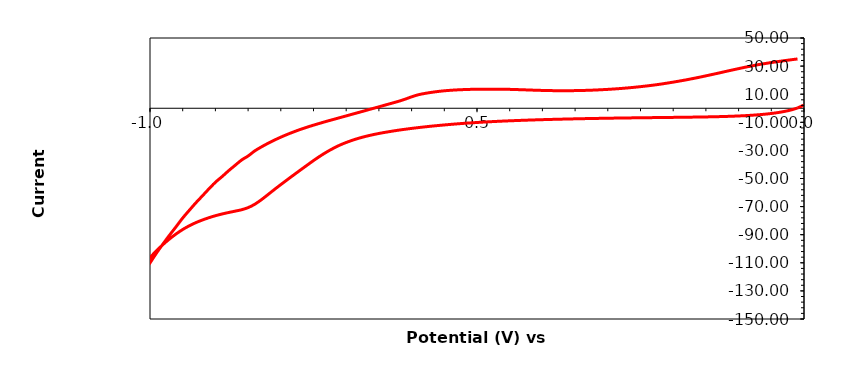
| Category | Series 0 |
|---|---|
| 6.24657e-05 | 2.305 |
| -0.00993776 | 0.171 |
| -0.019938 | -1.228 |
| -0.0299382 | -2.264 |
| -0.039938 | -3.077 |
| -0.0499382 | -3.72 |
| -0.0599384 | -4.232 |
| -0.0699387 | -4.644 |
| -0.0799389 | -4.987 |
| -0.0899391 | -5.264 |
| -0.0999391 | -5.493 |
| -0.109939 | -5.679 |
| -0.119939 | -5.836 |
| -0.12994 | -5.967 |
| -0.13994 | -6.079 |
| -0.14994 | -6.17 |
| -0.15994 | -6.249 |
| -0.16994 | -6.317 |
| -0.17994 | -6.379 |
| -0.18994 | -6.439 |
| -0.199941 | -6.499 |
| -0.209941 | -6.55 |
| -0.219941 | -6.605 |
| -0.229941 | -6.662 |
| -0.239941 | -6.714 |
| -0.249941 | -6.774 |
| -0.259942 | -6.83 |
| -0.269942 | -6.89 |
| -0.279942 | -6.958 |
| -0.289942 | -7.022 |
| -0.299942 | -7.1 |
| -0.309942 | -7.173 |
| -0.319942 | -7.259 |
| -0.329942 | -7.343 |
| -0.339943 | -7.434 |
| -0.349943 | -7.532 |
| -0.359943 | -7.64 |
| -0.369943 | -7.749 |
| -0.379943 | -7.862 |
| -0.389944 | -7.991 |
| -0.399944 | -8.12 |
| -0.409944 | -8.26 |
| -0.419944 | -8.418 |
| -0.429944 | -8.574 |
| -0.439944 | -8.75 |
| -0.449944 | -8.935 |
| -0.459944 | -9.133 |
| -0.469945 | -9.356 |
| -0.479945 | -9.592 |
| -0.489945 | -9.847 |
| -0.499945 | -10.126 |
| -0.509945 | -10.425 |
| -0.519945 | -10.749 |
| -0.529946 | -11.098 |
| -0.539946 | -11.476 |
| -0.549946 | -11.88 |
| -0.559946 | -12.31 |
| -0.569946 | -12.766 |
| -0.579947 | -13.257 |
| -0.589947 | -13.78 |
| -0.599947 | -14.347 |
| -0.609947 | -14.952 |
| -0.619947 | -15.606 |
| -0.629947 | -16.313 |
| -0.639947 | -17.096 |
| -0.649947 | -17.941 |
| -0.659948 | -18.903 |
| -0.669948 | -19.985 |
| -0.679948 | -21.228 |
| -0.689948 | -22.691 |
| -0.699948 | -24.354 |
| -0.709948 | -26.278 |
| -0.719949 | -28.585 |
| -0.729949 | -31.172 |
| -0.739949 | -34.072 |
| -0.749949 | -37.229 |
| -0.759949 | -40.579 |
| -0.769949 | -43.948 |
| -0.779949 | -47.373 |
| -0.78995 | -50.81 |
| -0.79995 | -54.323 |
| -0.80995 | -57.892 |
| -0.81995 | -61.592 |
| -0.82995 | -65.204 |
| -0.83995 | -68.379 |
| -0.849951 | -70.717 |
| -0.859951 | -72.242 |
| -0.869951 | -73.248 |
| -0.879951 | -74.217 |
| -0.889951 | -75.273 |
| -0.899951 | -76.486 |
| -0.909951 | -77.898 |
| -0.919952 | -79.548 |
| -0.929952 | -81.423 |
| -0.939952 | -83.667 |
| -0.949952 | -86.292 |
| -0.959952 | -89.404 |
| -0.969952 | -92.961 |
| -0.979953 | -96.93 |
| -0.989953 | -101.386 |
| -0.999953 | -106.28 |
| -1.00995 | -111.636 |
| -1.01995 | -117.336 |
| -1.02995 | -123.48 |
| -1.03995 | -129.955 |
| -1.04995 | -136.836 |
| -1.05995 | -144.099 |
| -1.06995 | -151.555 |
| -1.07995 | -159.293 |
| -1.08995 | -167.299 |
| -1.09995 | -176.284 |
| -1.10995 | -184.784 |
| -1.11995 | -193.034 |
| -1.12995 | -201.972 |
| -1.13996 | -211.285 |
| -1.14996 | -220.285 |
| -1.15996 | -229.785 |
| -1.16996 | -239.41 |
| -1.17996 | -248.848 |
| -1.18996 | -258.598 |
| -1.19996 | -268.598 |
| -1.20996 | -278.223 |
| -1.21996 | -288.598 |
| -1.22996 | -298.786 |
| -1.23996 | -309.224 |
| -1.24996 | -319.599 |
| -1.25996 | -330.161 |
| -1.26996 | -340.786 |
| -1.27996 | -351.974 |
| -1.28996 | -362.662 |
| -1.29996 | -373.349 |
| -1.30996 | -384.475 |
| -1.31996 | -395.787 |
| -1.32996 | -406.912 |
| -1.33996 | -417.663 |
| -1.34996 | -429.288 |
| -1.35996 | -440.663 |
| -1.36996 | -452.351 |
| -1.37996 | -464.038 |
| -1.38996 | -475.414 |
| -1.39996 | -487.289 |
| -1.40996 | -499.164 |
| -1.41996 | -510.977 |
| -1.42996 | -523.164 |
| -1.43996 | -534.977 |
| -1.44996 | -547.102 |
| -1.45996 | -559.165 |
| -1.46996 | -571.665 |
| -1.47996 | -583.915 |
| -1.48996 | -596.04 |
| -1.49996 | -608.666 |
| -1.50996 | -620.916 |
| -1.51996 | -633.353 |
| -1.52996 | -646.041 |
| -1.53996 | -658.479 |
| -1.54996 | -671.479 |
| -1.55996 | -683.854 |
| -1.56996 | -696.542 |
| -1.57996 | -708.855 |
| -1.58996 | -722.23 |
| -1.59996 | -734.668 |
| -1.60996 | -747.48 |
| -1.61996 | -760.293 |
| -1.62996 | -772.981 |
| -1.63996 | -786.231 |
| -1.64996 | -799.294 |
| -1.65996 | -812.419 |
| -1.66996 | -825.106 |
| -1.67996 | -838.169 |
| -1.68996 | -851.419 |
| -1.69996 | -864.169 |
| -1.70996 | -876.545 |
| -1.71996 | -889.67 |
| -1.72996 | -902.858 |
| -1.73996 | -916.42 |
| -1.74996 | -929.608 |
| -1.75996 | -942.858 |
| -1.76996 | -955.046 |
| -1.77996 | -968.359 |
| -1.78996 | -981.296 |
| -1.79997 | -994.234 |
| -1.78996 | -981.359 |
| -1.77996 | -968.421 |
| -1.76996 | -955.233 |
| -1.75996 | -942.233 |
| -1.74996 | -928.733 |
| -1.73996 | -916.42 |
| -1.72996 | -903.295 |
| -1.71996 | -890.732 |
| -1.70996 | -877.92 |
| -1.69996 | -865.107 |
| -1.68996 | -852.232 |
| -1.67996 | -839.544 |
| -1.66996 | -826.669 |
| -1.65996 | -814.481 |
| -1.64996 | -801.731 |
| -1.63996 | -788.856 |
| -1.62996 | -776.731 |
| -1.61996 | -764.355 |
| -1.60996 | -751.793 |
| -1.59996 | -739.168 |
| -1.58996 | -726.792 |
| -1.57996 | -714.605 |
| -1.56996 | -702.292 |
| -1.55996 | -689.792 |
| -1.54996 | -677.479 |
| -1.53996 | -665.104 |
| -1.52996 | -653.229 |
| -1.51996 | -641.354 |
| -1.50996 | -628.853 |
| -1.49996 | -616.853 |
| -1.48996 | -604.853 |
| -1.47996 | -592.853 |
| -1.46996 | -580.853 |
| -1.45996 | -569.103 |
| -1.44996 | -557.477 |
| -1.43996 | -545.727 |
| -1.42996 | -533.914 |
| -1.41996 | -522.289 |
| -1.40996 | -510.664 |
| -1.39996 | -499.351 |
| -1.38996 | -488.039 |
| -1.37996 | -476.164 |
| -1.36996 | -464.851 |
| -1.35996 | -453.351 |
| -1.34996 | -442.163 |
| -1.33996 | -431.038 |
| -1.32996 | -420.038 |
| -1.31996 | -408.725 |
| -1.30996 | -397.85 |
| -1.29996 | -386.85 |
| -1.28996 | -376.35 |
| -1.27996 | -365.349 |
| -1.26996 | -354.724 |
| -1.25996 | -344.099 |
| -1.24996 | -333.974 |
| -1.23996 | -323.286 |
| -1.22996 | -312.786 |
| -1.21996 | -302.598 |
| -1.20996 | -292.536 |
| -1.19996 | -282.411 |
| -1.18996 | -272.473 |
| -1.17996 | -262.848 |
| -1.16996 | -253.035 |
| -1.15996 | -243.722 |
| -1.14996 | -234.035 |
| -1.13996 | -224.66 |
| -1.12995 | -215.535 |
| -1.11995 | -206.097 |
| -1.10995 | -197.034 |
| -1.09995 | -188.347 |
| -1.08995 | -180.034 |
| -1.07995 | -171.159 |
| -1.06995 | -162.784 |
| -1.05995 | -154.596 |
| -1.04995 | -146.909 |
| -1.03995 | -139.096 |
| -1.02995 | -131.721 |
| -1.01995 | -124.158 |
| -1.00995 | -116.658 |
| -0.999953 | -110.033 |
| -0.989953 | -102.97 |
| -0.979953 | -96.47 |
| -0.969952 | -90.22 |
| -0.959952 | -84.22 |
| -0.949952 | -78.095 |
| -0.939952 | -72.657 |
| -0.929952 | -67.345 |
| -0.919952 | -62.407 |
| -0.909951 | -57.407 |
| -0.899951 | -52.657 |
| -0.889951 | -48.72 |
| -0.879951 | -44.532 |
| -0.869951 | -40.657 |
| -0.859951 | -36.844 |
| -0.849951 | -33.969 |
| -0.83995 | -30.404 |
| -0.82995 | -27.597 |
| -0.81995 | -25.054 |
| -0.80995 | -22.716 |
| -0.79995 | -20.572 |
| -0.78995 | -18.585 |
| -0.779949 | -16.76 |
| -0.769949 | -15.047 |
| -0.759949 | -13.491 |
| -0.749949 | -12.028 |
| -0.739949 | -10.647 |
| -0.729949 | -9.285 |
| -0.719949 | -8.016 |
| -0.709948 | -6.716 |
| -0.699948 | -5.447 |
| -0.689948 | -4.134 |
| -0.679948 | -2.872 |
| -0.669948 | -1.559 |
| -0.659948 | -0.259 |
| -0.649947 | 1.009 |
| -0.639947 | 2.335 |
| -0.629947 | 3.625 |
| -0.619947 | 4.944 |
| -0.609947 | 6.44 |
| -0.599947 | 8.145 |
| -0.589947 | 9.583 |
| -0.579947 | 10.529 |
| -0.569946 | 11.293 |
| -0.559946 | 11.919 |
| -0.549946 | 12.424 |
| -0.539946 | 12.796 |
| -0.529946 | 13.087 |
| -0.519945 | 13.284 |
| -0.509945 | 13.437 |
| -0.499945 | 13.523 |
| -0.489945 | 13.58 |
| -0.479945 | 13.604 |
| -0.469945 | 13.592 |
| -0.459944 | 13.53 |
| -0.449944 | 13.441 |
| -0.439944 | 13.306 |
| -0.429944 | 13.152 |
| -0.419944 | 12.982 |
| -0.409944 | 12.821 |
| -0.399944 | 12.687 |
| -0.389944 | 12.584 |
| -0.379943 | 12.512 |
| -0.369943 | 12.485 |
| -0.359943 | 12.499 |
| -0.349943 | 12.551 |
| -0.339943 | 12.642 |
| -0.329942 | 12.777 |
| -0.319942 | 12.954 |
| -0.309942 | 13.174 |
| -0.299942 | 13.432 |
| -0.289942 | 13.727 |
| -0.279942 | 14.064 |
| -0.269942 | 14.459 |
| -0.259942 | 14.891 |
| -0.249941 | 15.374 |
| -0.239941 | 15.904 |
| -0.229941 | 16.485 |
| -0.219941 | 17.11 |
| -0.209941 | 17.847 |
| -0.199941 | 18.585 |
| -0.18994 | 19.391 |
| -0.17994 | 20.235 |
| -0.16994 | 21.135 |
| -0.15994 | 22.066 |
| -0.14994 | 23.066 |
| -0.13994 | 24.078 |
| -0.12994 | 25.104 |
| -0.119939 | 26.166 |
| -0.109939 | 27.197 |
| -0.0999391 | 28.21 |
| -0.0899391 | 29.197 |
| -0.0799389 | 30.11 |
| -0.0699387 | 31.029 |
| -0.0599384 | 31.791 |
| -0.0499382 | 32.541 |
| -0.039938 | 33.21 |
| -0.0299382 | 33.866 |
| -0.019938 | 34.491 |
| -0.00993776 | 35.079 |